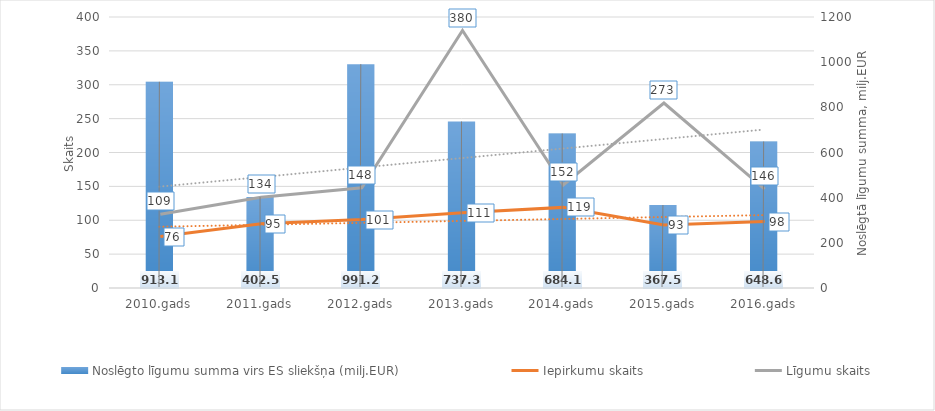
| Category | Noslēgto līgumu summa virs ES sliekšņa (milj.EUR) |
|---|---|
| 2010.gads | 913.1 |
| 2011.gads | 402.5 |
| 2012.gads | 991.2 |
| 2013.gads | 737.3 |
| 2014.gads | 684.1 |
| 2015.gads | 367.5 |
| 2016.gads | 648.6 |